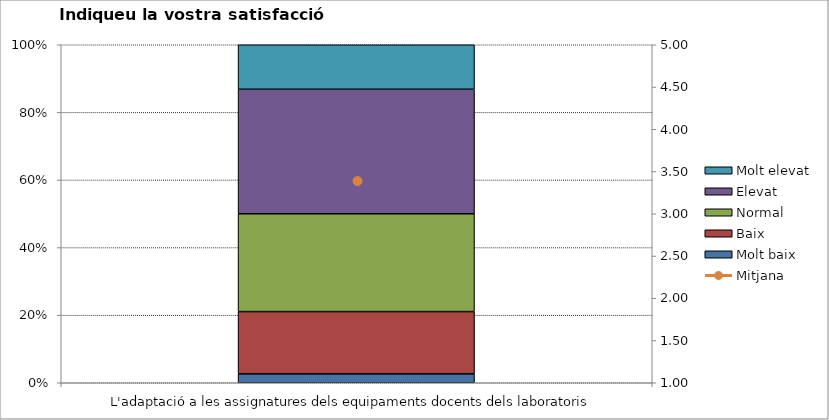
| Category | Molt baix | Baix | Normal  | Elevat | Molt elevat |
|---|---|---|---|---|---|
| L'adaptació a les assignatures dels equipaments docents dels laboratoris | 1 | 7 | 11 | 14 | 5 |